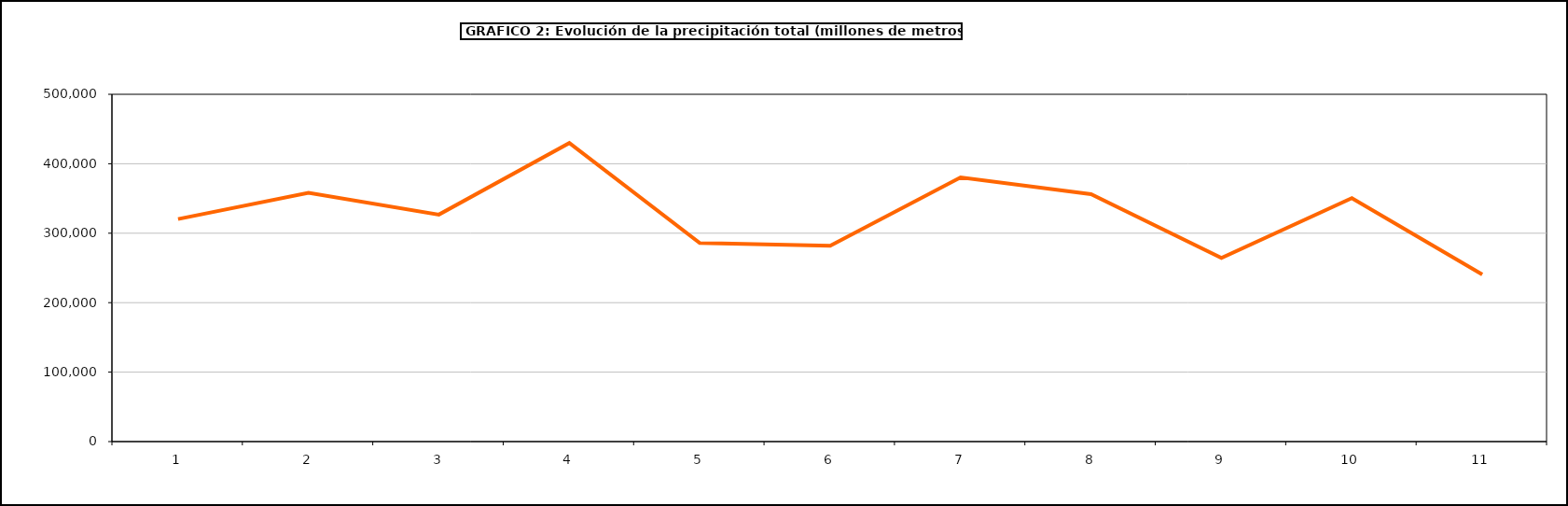
| Category | Series 0 |
|---|---|
| 0 | 320442 |
| 1 | 358273.25 |
| 2 | 326778 |
| 3 | 429768 |
| 4 | 285948 |
| 5 | 281817 |
| 6 | 380420 |
| 7 | 356097 |
| 8 | 264511.7 |
| 9 | 350442.2 |
| 10 | 240463.8 |